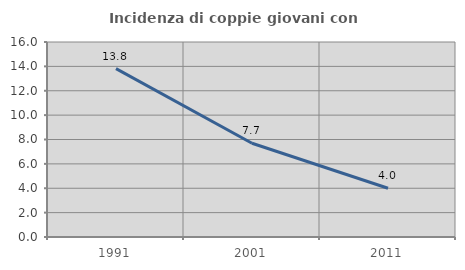
| Category | Incidenza di coppie giovani con figli |
|---|---|
| 1991.0 | 13.813 |
| 2001.0 | 7.692 |
| 2011.0 | 3.997 |